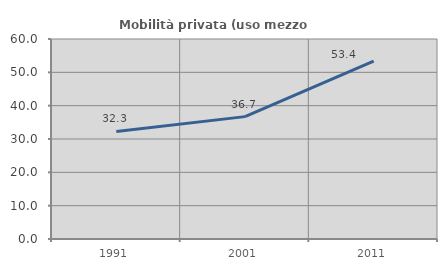
| Category | Mobilità privata (uso mezzo privato) |
|---|---|
| 1991.0 | 32.273 |
| 2001.0 | 36.714 |
| 2011.0 | 53.361 |